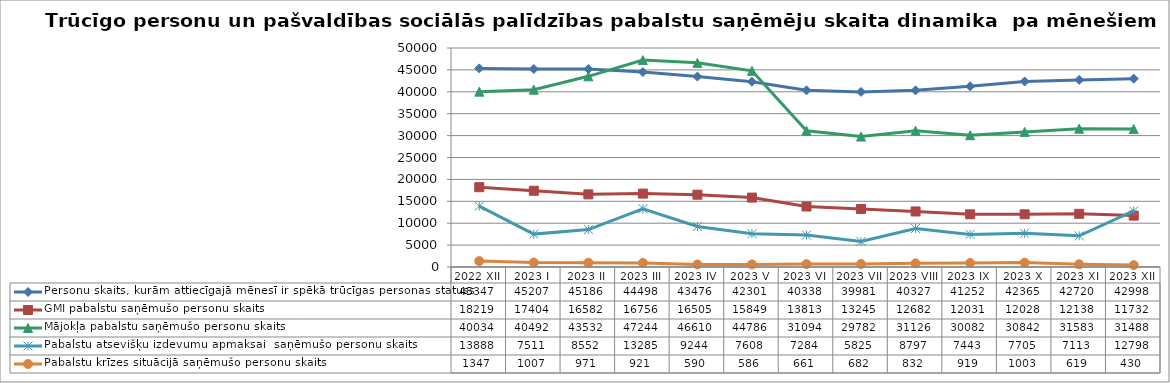
| Category | Personu skaits, kurām attiecīgajā mēnesī ir spēkā trūcīgas personas statuss | GMI pabalstu saņēmušo personu skaits | Mājokļa pabalstu saņēmušo personu skaits | Pabalstu atsevišķu izdevumu apmaksai  saņēmušo personu skaits | Pabalstu krīzes situācijā saņēmušo personu skaits |
|---|---|---|---|---|---|
| 2022 XII | 45347 | 18219 | 40034 | 13888 | 1347 |
| 2023 I | 45207 | 17404 | 40492 | 7511 | 1007 |
| 2023 II | 45186 | 16582 | 43532 | 8552 | 971 |
| 2023 III | 44498 | 16756 | 47244 | 13285 | 921 |
| 2023 IV | 43476 | 16505 | 46610 | 9244 | 590 |
| 2023 V | 42301 | 15849 | 44786 | 7608 | 586 |
| 2023 VI | 40338 | 13813 | 31094 | 7284 | 661 |
| 2023 VII | 39981 | 13245 | 29782 | 5825 | 682 |
| 2023 VIII | 40327 | 12682 | 31126 | 8797 | 832 |
| 2023 IX | 41252 | 12031 | 30082 | 7443 | 919 |
| 2023 X | 42365 | 12028 | 30842 | 7705 | 1003 |
| 2023 XI | 42720 | 12138 | 31583 | 7113 | 619 |
| 2023 XII | 42998 | 11732 | 31488 | 12798 | 430 |